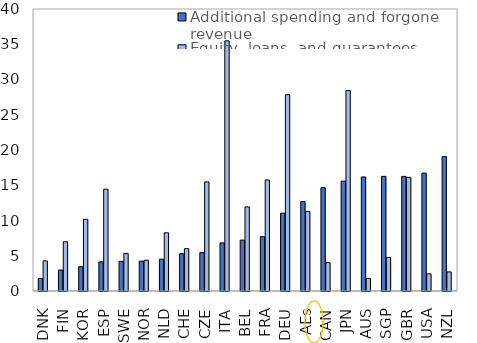
| Category | Additional spending and forgone revenue | Equity, loans, and guarantees |
|---|---|---|
| DNK | 1.773 | 4.267 |
| FIN | 2.974 | 6.984 |
| KOR | 3.442 | 10.171 |
| ESP | 4.13 | 14.445 |
| SWE | 4.201 | 5.33 |
| NOR | 4.237 | 4.361 |
| NLD | 4.519 | 8.251 |
| CHE | 5.288 | 6.008 |
| CZE | 5.444 | 15.471 |
| ITA | 6.825 | 35.48 |
| BEL | 7.22 | 11.922 |
| FRA | 7.71 | 15.753 |
| DEU | 11.034 | 27.849 |
| AEs | 12.683 | 11.278 |
| CAN | 14.646 | 4.021 |
| JPN | 15.58 | 28.44 |
| AUS | 16.178 | 1.79 |
| SGP | 16.258 | 4.75 |
| GBR | 16.258 | 16.116 |
| USA | 16.719 | 2.434 |
| NZL | 19.063 | 2.708 |